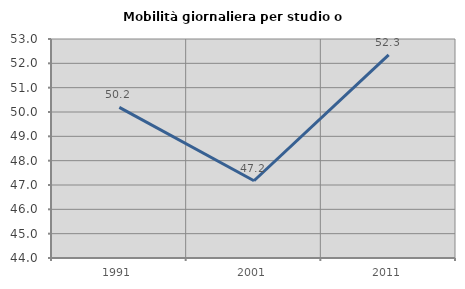
| Category | Mobilità giornaliera per studio o lavoro |
|---|---|
| 1991.0 | 50.19 |
| 2001.0 | 47.174 |
| 2011.0 | 52.344 |